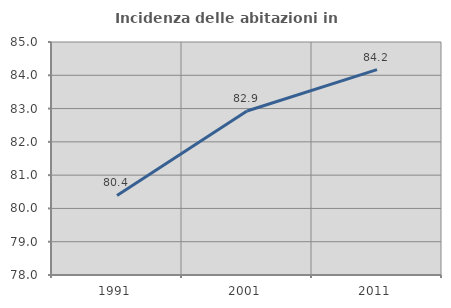
| Category | Incidenza delle abitazioni in proprietà  |
|---|---|
| 1991.0 | 80.39 |
| 2001.0 | 82.927 |
| 2011.0 | 84.171 |